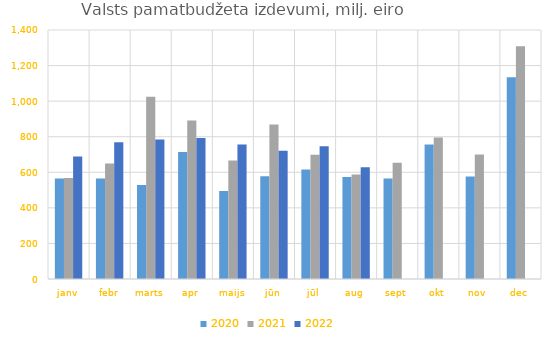
| Category | 2020 | 2021 | 2022 |
|---|---|---|---|
| janv | 564731.731 | 567519.181 | 689237.965 |
| febr | 564358.73 | 649337.389 | 769410.975 |
| marts | 528520.586 | 1024865.74 | 784728.56 |
| apr | 713875.034 | 890597.122 | 792151.693 |
| maijs | 494549.632 | 666390.632 | 756370.204 |
| jūn | 578082.287 | 868998.418 | 721608.297 |
| jūl | 616330.617 | 698429.777 | 745948.556 |
| aug | 573848.626 | 587185.295 | 628998.795 |
| sept | 565735.173 | 652999.82 | 0 |
| okt | 755917.602 | 795708.656 | 0 |
| nov | 576740.78 | 700002.359 | 0 |
| dec | 1134353.728 | 1308324.606 | 0 |